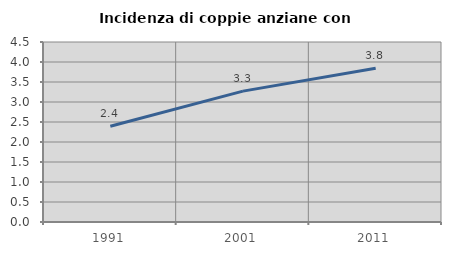
| Category | Incidenza di coppie anziane con figli |
|---|---|
| 1991.0 | 2.394 |
| 2001.0 | 3.272 |
| 2011.0 | 3.843 |